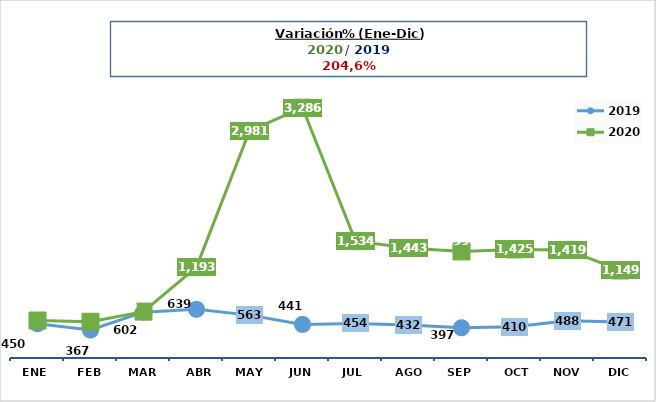
| Category | 2019 | 2020 |
|---|---|---|
| Ene | 450 | 492 |
| Feb | 367 | 476 |
| Mar | 602 | 609 |
| Abr | 639 | 1193 |
| May | 563 | 2981 |
| Jun | 441 | 3286 |
| Jul | 454 | 1534 |
| Ago | 432 | 1443 |
| Sep | 397 | 1399 |
| Oct | 410 | 1425 |
| Nov | 488 | 1419 |
| Dic | 471 | 1149 |